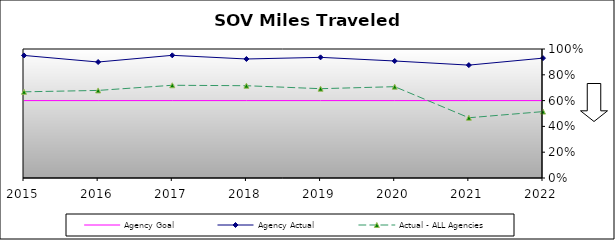
| Category | Agency Goal | Agency Actual | Actual - ALL Agencies |
|---|---|---|---|
| 2015.0 | 0.6 | 0.95 | 0.668 |
| 2016.0 | 0.6 | 0.899 | 0.679 |
| 2017.0 | 0.6 | 0.951 | 0.719 |
| 2018.0 | 0.6 | 0.922 | 0.715 |
| 2019.0 | 0.6 | 0.935 | 0.692 |
| 2020.0 | 0.6 | 0.907 | 0.708 |
| 2021.0 | 0.6 | 0.875 | 0.467 |
| 2022.0 | 0.6 | 0.929 | 0.515 |